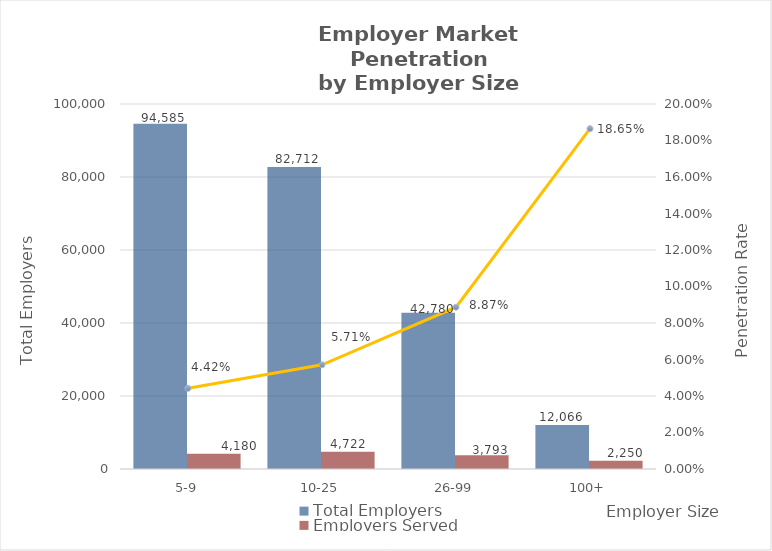
| Category | Total Employers | Employers Served |
|---|---|---|
| 5-9 | 94585 | 4180 |
| 10-25 | 82712 | 4722 |
| 26-99 | 42780 | 3793 |
| 100+ | 12066 | 2250 |